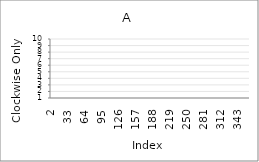
| Category | Series 0 |
|---|---|
| 2.0 | 6 |
| 3.0 | 3 |
| 4.0 | 1 |
| 5.0 | 4 |
| 6.0 | 6 |
| 7.0 | 4 |
| 8.0 | 4 |
| 9.0 | 9 |
| 10.0 | 8 |
| 11.0 | 3 |
| 12.0 | 8 |
| 13.0 | 5 |
| 14.0 | 10 |
| 15.0 | 7 |
| 16.0 | 8 |
| 17.0 | 5 |
| 18.0 | 4 |
| 19.0 | 10 |
| 20.0 | 3 |
| 21.0 | 7 |
| 22.0 | 9 |
| 23.0 | 5 |
| 24.0 | 1 |
| 25.0 | 5 |
| 26.0 | 9 |
| 27.0 | 4 |
| 28.0 | 3 |
| 29.0 | 2 |
| 30.0 | 5 |
| 31.0 | 99 |
| 32.0 | 99 |
| 33.0 | 99 |
| 34.0 | 99 |
| 35.0 | 99 |
| 36.0 | 99 |
| 37.0 | 99 |
| 38.0 | 99 |
| 39.0 | 99 |
| 40.0 | 99 |
| 41.0 | 99 |
| 42.0 | 99 |
| 43.0 | 99 |
| 44.0 | 99 |
| 45.0 | 99 |
| 46.0 | 99 |
| 47.0 | 99 |
| 48.0 | 99 |
| 49.0 | 99 |
| 50.0 | 99 |
| 51.0 | 99 |
| 52.0 | 99 |
| 53.0 | 99 |
| 54.0 | 99 |
| 55.0 | 99 |
| 56.0 | 99 |
| 57.0 | 99 |
| 58.0 | 99 |
| 59.0 | 99 |
| 60.0 | 99 |
| 61.0 | 99 |
| 62.0 | 99 |
| 63.0 | 99 |
| 64.0 | 99 |
| 65.0 | 99 |
| 66.0 | 99 |
| 67.0 | 99 |
| 68.0 | 99 |
| 69.0 | 99 |
| 70.0 | 99 |
| 71.0 | 99 |
| 72.0 | 99 |
| 73.0 | 99 |
| 74.0 | 99 |
| 75.0 | 99 |
| 76.0 | 99 |
| 77.0 | 99 |
| 78.0 | 99 |
| 79.0 | 99 |
| 80.0 | 99 |
| 81.0 | 99 |
| 82.0 | 99 |
| 83.0 | 99 |
| 84.0 | 99 |
| 85.0 | 99 |
| 86.0 | 99 |
| 87.0 | 99 |
| 88.0 | 99 |
| 89.0 | 99 |
| 90.0 | 99 |
| 91.0 | 99 |
| 92.0 | 99 |
| 93.0 | 99 |
| 94.0 | 99 |
| 95.0 | 99 |
| 96.0 | 99 |
| 97.0 | 99 |
| 98.0 | 99 |
| 99.0 | 99 |
| 100.0 | 99 |
| 101.0 | 99 |
| 102.0 | 99 |
| 103.0 | 99 |
| 104.0 | 99 |
| 105.0 | 99 |
| 106.0 | 99 |
| 107.0 | 99 |
| 108.0 | 99 |
| 109.0 | 99 |
| 110.0 | 99 |
| 111.0 | 99 |
| 112.0 | 99 |
| 113.0 | 99 |
| 114.0 | 99 |
| 115.0 | 99 |
| 116.0 | 99 |
| 117.0 | 99 |
| 118.0 | 99 |
| 119.0 | 99 |
| 120.0 | 99 |
| 121.0 | 99 |
| 122.0 | 99 |
| 123.0 | 99 |
| 124.0 | 99 |
| 125.0 | 99 |
| 126.0 | 99 |
| 127.0 | 99 |
| 128.0 | 99 |
| 129.0 | 99 |
| 130.0 | 99 |
| 131.0 | 99 |
| 132.0 | 99 |
| 133.0 | 99 |
| 134.0 | 99 |
| 135.0 | 99 |
| 136.0 | 99 |
| 137.0 | 99 |
| 138.0 | 99 |
| 139.0 | 99 |
| 140.0 | 99 |
| 141.0 | 99 |
| 142.0 | 99 |
| 143.0 | 99 |
| 144.0 | 99 |
| 145.0 | 99 |
| 146.0 | 99 |
| 147.0 | 99 |
| 148.0 | 99 |
| 149.0 | 99 |
| 150.0 | 99 |
| 151.0 | 99 |
| 152.0 | 99 |
| 153.0 | 99 |
| 154.0 | 99 |
| 155.0 | 99 |
| 156.0 | 99 |
| 157.0 | 99 |
| 158.0 | 99 |
| 159.0 | 99 |
| 160.0 | 99 |
| 161.0 | 99 |
| 162.0 | 99 |
| 163.0 | 99 |
| 164.0 | 99 |
| 165.0 | 99 |
| 166.0 | 99 |
| 167.0 | 99 |
| 168.0 | 99 |
| 169.0 | 99 |
| 170.0 | 99 |
| 171.0 | 99 |
| 172.0 | 99 |
| 173.0 | 99 |
| 174.0 | 99 |
| 175.0 | 99 |
| 176.0 | 99 |
| 177.0 | 99 |
| 178.0 | 99 |
| 179.0 | 99 |
| 180.0 | 99 |
| 181.0 | 99 |
| 182.0 | 99 |
| 183.0 | 99 |
| 184.0 | 99 |
| 185.0 | 99 |
| 186.0 | 99 |
| 187.0 | 99 |
| 188.0 | 99 |
| 189.0 | 99 |
| 190.0 | 99 |
| 191.0 | 99 |
| 192.0 | 99 |
| 193.0 | 99 |
| 194.0 | 99 |
| 195.0 | 99 |
| 196.0 | 99 |
| 197.0 | 99 |
| 198.0 | 99 |
| 199.0 | 99 |
| 200.0 | 99 |
| 201.0 | 99 |
| 202.0 | 99 |
| 203.0 | 99 |
| 204.0 | 99 |
| 205.0 | 99 |
| 206.0 | 99 |
| 207.0 | 99 |
| 208.0 | 99 |
| 209.0 | 99 |
| 210.0 | 99 |
| 211.0 | 99 |
| 212.0 | 99 |
| 213.0 | 99 |
| 214.0 | 99 |
| 215.0 | 99 |
| 216.0 | 99 |
| 217.0 | 99 |
| 218.0 | 99 |
| 219.0 | 99 |
| 220.0 | 99 |
| 221.0 | 99 |
| 222.0 | 99 |
| 223.0 | 99 |
| 224.0 | 99 |
| 225.0 | 99 |
| 226.0 | 99 |
| 227.0 | 99 |
| 228.0 | 99 |
| 229.0 | 99 |
| 230.0 | 99 |
| 231.0 | 99 |
| 232.0 | 99 |
| 233.0 | 99 |
| 234.0 | 99 |
| 235.0 | 99 |
| 236.0 | 99 |
| 237.0 | 99 |
| 238.0 | 99 |
| 239.0 | 99 |
| 240.0 | 99 |
| 241.0 | 99 |
| 242.0 | 99 |
| 243.0 | 99 |
| 244.0 | 99 |
| 245.0 | 99 |
| 246.0 | 99 |
| 247.0 | 99 |
| 248.0 | 99 |
| 249.0 | 99 |
| 250.0 | 99 |
| 251.0 | 99 |
| 252.0 | 99 |
| 253.0 | 99 |
| 254.0 | 99 |
| 255.0 | 99 |
| 256.0 | 99 |
| 257.0 | 99 |
| 258.0 | 99 |
| 259.0 | 99 |
| 260.0 | 99 |
| 261.0 | 99 |
| 262.0 | 99 |
| 263.0 | 99 |
| 264.0 | 99 |
| 265.0 | 99 |
| 266.0 | 99 |
| 267.0 | 99 |
| 268.0 | 99 |
| 269.0 | 99 |
| 270.0 | 99 |
| 271.0 | 99 |
| 272.0 | 99 |
| 273.0 | 99 |
| 274.0 | 99 |
| 275.0 | 99 |
| 276.0 | 99 |
| 277.0 | 99 |
| 278.0 | 99 |
| 279.0 | 99 |
| 280.0 | 99 |
| 281.0 | 99 |
| 282.0 | 99 |
| 283.0 | 99 |
| 284.0 | 99 |
| 285.0 | 99 |
| 286.0 | 99 |
| 287.0 | 99 |
| 288.0 | 99 |
| 289.0 | 99 |
| 290.0 | 99 |
| 291.0 | 99 |
| 292.0 | 99 |
| 293.0 | 99 |
| 294.0 | 99 |
| 295.0 | 99 |
| 296.0 | 99 |
| 297.0 | 99 |
| 298.0 | 99 |
| 299.0 | 99 |
| 300.0 | 99 |
| 301.0 | 99 |
| 302.0 | 99 |
| 303.0 | 99 |
| 304.0 | 99 |
| 305.0 | 99 |
| 306.0 | 99 |
| 307.0 | 99 |
| 308.0 | 99 |
| 309.0 | 99 |
| 310.0 | 99 |
| 311.0 | 99 |
| 312.0 | 99 |
| 313.0 | 99 |
| 314.0 | 99 |
| 315.0 | 99 |
| 316.0 | 99 |
| 317.0 | 99 |
| 318.0 | 99 |
| 319.0 | 99 |
| 320.0 | 99 |
| 321.0 | 99 |
| 322.0 | 99 |
| 323.0 | 99 |
| 324.0 | 99 |
| 325.0 | 99 |
| 326.0 | 99 |
| 327.0 | 99 |
| 328.0 | 99 |
| 329.0 | 99 |
| 330.0 | 99 |
| 331.0 | 99 |
| 332.0 | 99 |
| 333.0 | 99 |
| 334.0 | 99 |
| 335.0 | 99 |
| 336.0 | 99 |
| 337.0 | 99 |
| 338.0 | 99 |
| 339.0 | 99 |
| 340.0 | 99 |
| 341.0 | 99 |
| 342.0 | 99 |
| 343.0 | 99 |
| 344.0 | 99 |
| 345.0 | 99 |
| 346.0 | 99 |
| 347.0 | 99 |
| 348.0 | 99 |
| 349.0 | 99 |
| 350.0 | 99 |
| 351.0 | 99 |
| 352.0 | 99 |
| 353.0 | 99 |
| 354.0 | 99 |
| 355.0 | 99 |
| 356.0 | 99 |
| 357.0 | 99 |
| 358.0 | 99 |
| 359.0 | 99 |
| 360.0 | 99 |
| 361.0 | 99 |
| 362.0 | 99 |
| 363.0 | 99 |
| 364.0 | 99 |
| 365.0 | 99 |